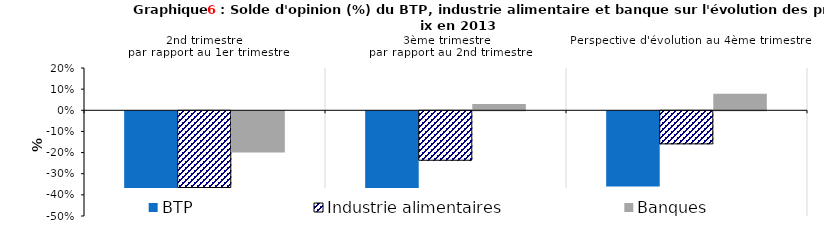
| Category | BTP | Industrie alimentaires | Banques |
|---|---|---|---|
| 2nd trimestre 
par rapport au 1er trimestre | -0.448 | -0.363 | -0.194 |
| 3ème trimestre 
par rapport au 2nd trimestre | -0.415 | -0.234 | 0.03 |
| Perspective d'évolution au 4ème trimestre | -0.356 | -0.156 | 0.078 |